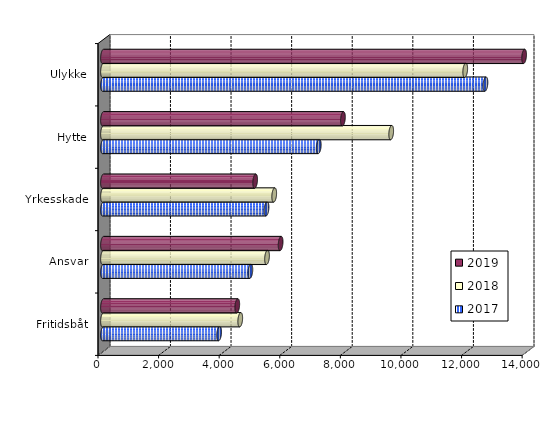
| Category | 2017 | 2018 | 2019 |
|---|---|---|---|
| Fritidsbåt | 3833.546 | 4529.924 | 4431.519 |
| Ansvar | 4864.401 | 5414.37 | 5862.388 |
| Yrkesskade | 5397.574 | 5650.922 | 5021.556 |
| Hytte | 7122.066 | 9512.477 | 7919.316 |
| Ulykke | 12623.589 | 11956.072 | 13899.585 |